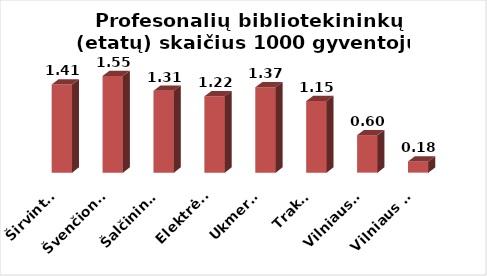
| Category | Series 0 |
|---|---|
| Širvintos | 1.413 |
| Švenčionys | 1.549 |
| Šalčininkai | 1.311 |
| Elektrėnai | 1.222 |
| Ukmergė | 1.367 |
| Trakai | 1.146 |
| Vilniaus r. | 0.601 |
| Vilniaus m. | 0.179 |